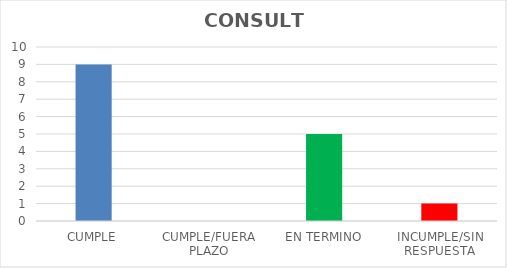
| Category | TOTAL |
|---|---|
| CUMPLE | 9 |
| CUMPLE/FUERA PLAZO | 0 |
| EN TERMINO | 5 |
| INCUMPLE/SIN RESPUESTA | 1 |